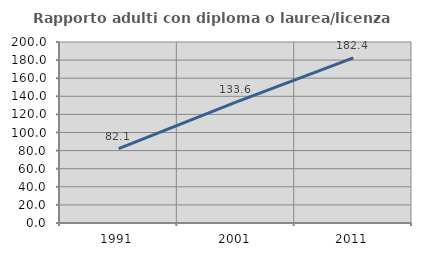
| Category | Rapporto adulti con diploma o laurea/licenza media  |
|---|---|
| 1991.0 | 82.143 |
| 2001.0 | 133.606 |
| 2011.0 | 182.406 |